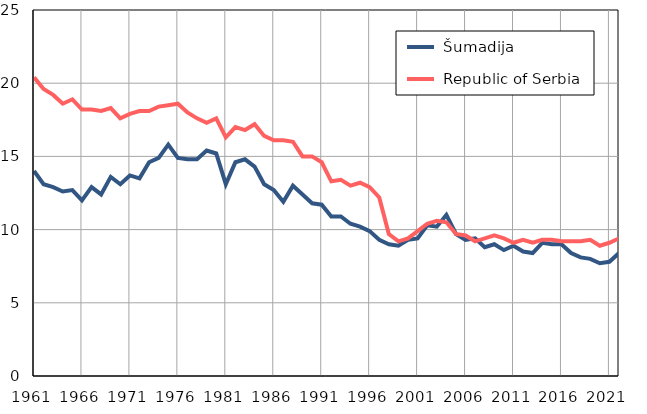
| Category |  Šumadija |  Republic of Serbia |
|---|---|---|
| 1961.0 | 14 | 20.4 |
| 1962.0 | 13.1 | 19.6 |
| 1963.0 | 12.9 | 19.2 |
| 1964.0 | 12.6 | 18.6 |
| 1965.0 | 12.7 | 18.9 |
| 1966.0 | 12 | 18.2 |
| 1967.0 | 12.9 | 18.2 |
| 1968.0 | 12.4 | 18.1 |
| 1969.0 | 13.6 | 18.3 |
| 1970.0 | 13.1 | 17.6 |
| 1971.0 | 13.7 | 17.9 |
| 1972.0 | 13.5 | 18.1 |
| 1973.0 | 14.6 | 18.1 |
| 1974.0 | 14.9 | 18.4 |
| 1975.0 | 15.8 | 18.5 |
| 1976.0 | 14.9 | 18.6 |
| 1977.0 | 14.8 | 18 |
| 1978.0 | 14.8 | 17.6 |
| 1979.0 | 15.4 | 17.3 |
| 1980.0 | 15.2 | 17.6 |
| 1981.0 | 13.1 | 16.3 |
| 1982.0 | 14.6 | 17 |
| 1983.0 | 14.8 | 16.8 |
| 1984.0 | 14.3 | 17.2 |
| 1985.0 | 13.1 | 16.4 |
| 1986.0 | 12.7 | 16.1 |
| 1987.0 | 11.9 | 16.1 |
| 1988.0 | 13 | 16 |
| 1989.0 | 12.4 | 15 |
| 1990.0 | 11.8 | 15 |
| 1991.0 | 11.7 | 14.6 |
| 1992.0 | 10.9 | 13.3 |
| 1993.0 | 10.9 | 13.4 |
| 1994.0 | 10.4 | 13 |
| 1995.0 | 10.2 | 13.2 |
| 1996.0 | 9.9 | 12.9 |
| 1997.0 | 9.3 | 12.2 |
| 1998.0 | 9 | 9.7 |
| 1999.0 | 8.9 | 9.2 |
| 2000.0 | 9.3 | 9.4 |
| 2001.0 | 9.4 | 9.9 |
| 2002.0 | 10.3 | 10.4 |
| 2003.0 | 10.2 | 10.6 |
| 2004.0 | 11 | 10.5 |
| 2005.0 | 9.7 | 9.7 |
| 2006.0 | 9.3 | 9.6 |
| 2007.0 | 9.4 | 9.2 |
| 2008.0 | 8.8 | 9.4 |
| 2009.0 | 9 | 9.6 |
| 2010.0 | 8.6 | 9.4 |
| 2011.0 | 8.9 | 9.1 |
| 2012.0 | 8.5 | 9.3 |
| 2013.0 | 8.4 | 9.1 |
| 2014.0 | 9.1 | 9.3 |
| 2015.0 | 9 | 9.3 |
| 2016.0 | 9 | 9.2 |
| 2017.0 | 8.4 | 9.2 |
| 2018.0 | 8.1 | 9.2 |
| 2019.0 | 8 | 9.3 |
| 2020.0 | 7.7 | 8.9 |
| 2021.0 | 7.8 | 9.1 |
| 2022.0 | 8.4 | 9.4 |